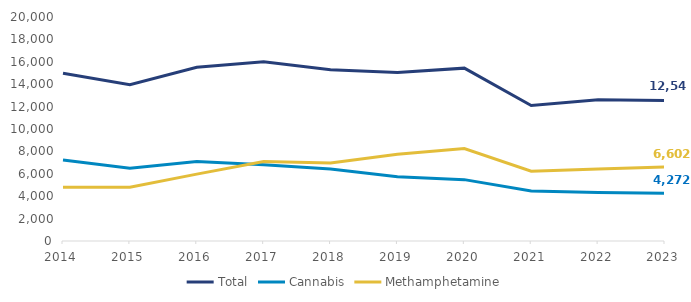
| Category | Total | Cannabis | Methamphetamine |
|---|---|---|---|
| 2014.0 | 14976 | 7223 | 4789 |
| 2015.0 | 13954 | 6494 | 4798 |
| 2016.0 | 15510 | 7106 | 5972 |
| 2017.0 | 16005 | 6807 | 7103 |
| 2018.0 | 15297 | 6435 | 6955 |
| 2019.0 | 15051 | 5735 | 7738 |
| 2020.0 | 15434 | 5479 | 8255 |
| 2021.0 | 12098 | 4461 | 6238 |
| 2022.0 | 12617 | 4335 | 6420 |
| 2023.0 | 12543 | 4272 | 6602 |